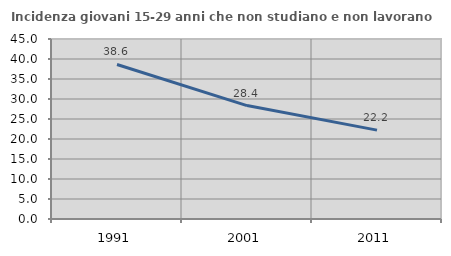
| Category | Incidenza giovani 15-29 anni che non studiano e non lavorano  |
|---|---|
| 1991.0 | 38.628 |
| 2001.0 | 28.358 |
| 2011.0 | 22.222 |